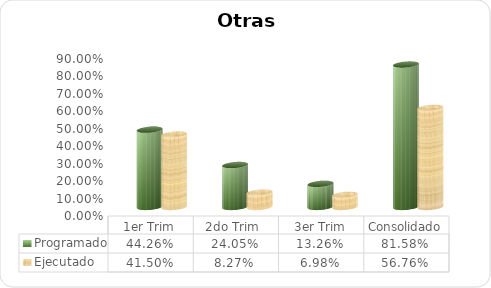
| Category | Programado | Ejecutado  |
|---|---|---|
| 1er Trim | 0.443 | 0.415 |
| 2do Trim  | 0.241 | 0.083 |
| 3er Trim | 0.133 | 0.07 |
| Consolidado | 0.816 | 0.568 |